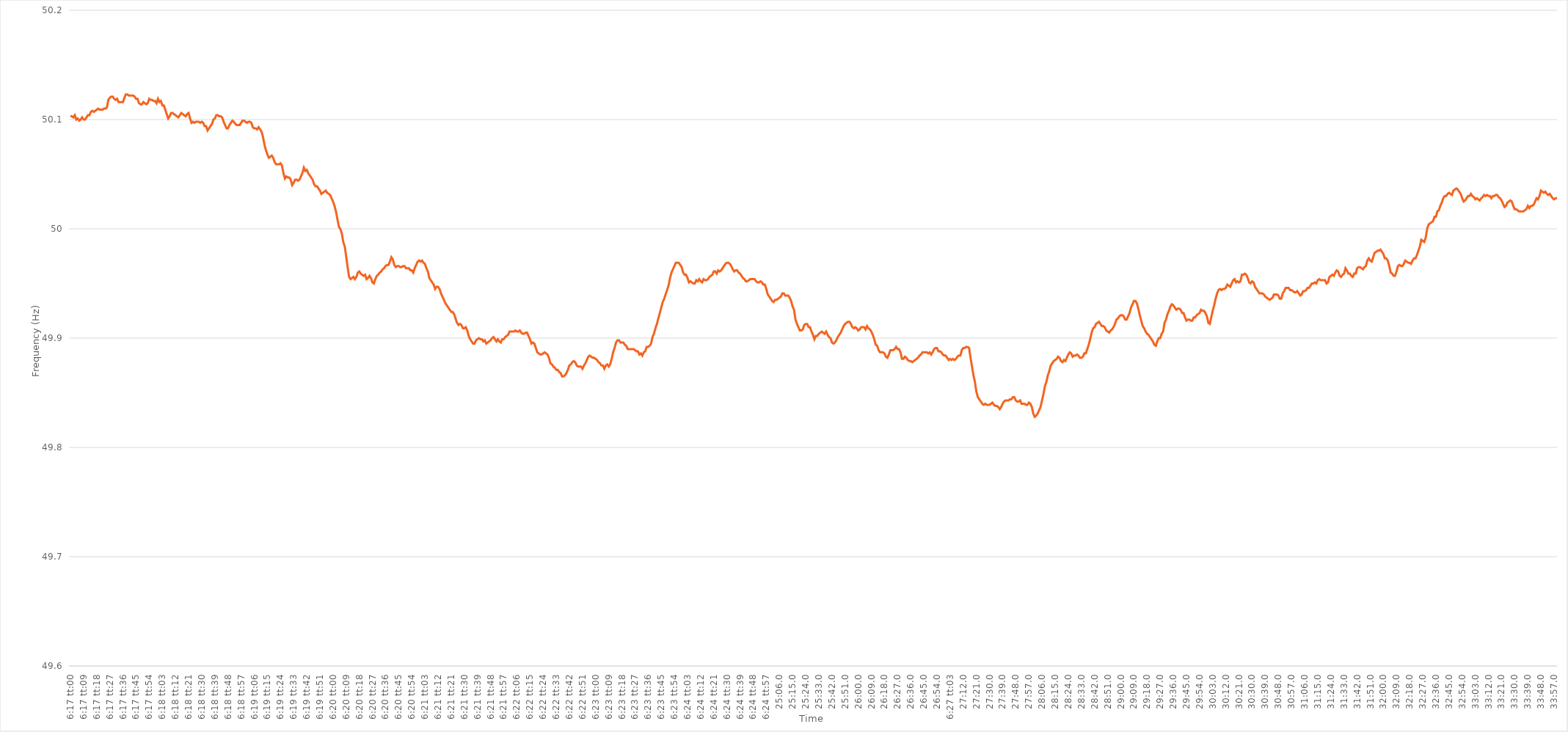
| Category | Series 0 |
|---|---|
| 0.26180555555555557 | 50.103 |
| 0.2618171296296296 | 50.103 |
| 0.2618287037037037 | 50.102 |
| 0.2618402777777778 | 50.104 |
| 0.26185185185185184 | 50.1 |
| 0.26186342592592593 | 50.101 |
| 0.261875 | 50.099 |
| 0.26188657407407406 | 50.1 |
| 0.26189814814814816 | 50.102 |
| 0.26190972222222225 | 50.1 |
| 0.2619212962962963 | 50.1 |
| 0.2619328703703704 | 50.102 |
| 0.2619444444444445 | 50.104 |
| 0.2619560185185185 | 50.104 |
| 0.26196759259259256 | 50.107 |
| 0.26197916666666665 | 50.108 |
| 0.26199074074074075 | 50.107 |
| 0.2620023148148148 | 50.108 |
| 0.2620138888888889 | 50.109 |
| 0.262025462962963 | 50.11 |
| 0.262037037037037 | 50.109 |
| 0.2620486111111111 | 50.109 |
| 0.2620601851851852 | 50.109 |
| 0.26207175925925924 | 50.11 |
| 0.26208333333333333 | 50.11 |
| 0.26209490740740743 | 50.111 |
| 0.26210648148148147 | 50.118 |
| 0.26211805555555556 | 50.12 |
| 0.26212962962962966 | 50.121 |
| 0.2621412037037037 | 50.121 |
| 0.2621527777777778 | 50.119 |
| 0.2621643518518519 | 50.118 |
| 0.2621759259259259 | 50.119 |
| 0.2621875 | 50.116 |
| 0.26219907407407406 | 50.116 |
| 0.26221064814814815 | 50.116 |
| 0.2622222222222222 | 50.116 |
| 0.2622337962962963 | 50.12 |
| 0.2622453703703704 | 50.123 |
| 0.2622569444444444 | 50.123 |
| 0.2622685185185185 | 50.122 |
| 0.2622800925925926 | 50.122 |
| 0.26229166666666665 | 50.122 |
| 0.26230324074074074 | 50.122 |
| 0.26231481481481483 | 50.121 |
| 0.2623263888888889 | 50.119 |
| 0.26233796296296297 | 50.119 |
| 0.26234953703703706 | 50.115 |
| 0.2623611111111111 | 50.114 |
| 0.2623726851851852 | 50.114 |
| 0.2623842592592593 | 50.116 |
| 0.26239583333333333 | 50.115 |
| 0.2624074074074074 | 50.114 |
| 0.2624189814814815 | 50.115 |
| 0.26243055555555556 | 50.119 |
| 0.2624421296296296 | 50.118 |
| 0.2624537037037037 | 50.118 |
| 0.2624652777777778 | 50.117 |
| 0.2624768518518518 | 50.117 |
| 0.2624884259259259 | 50.115 |
| 0.2625 | 50.119 |
| 0.26251157407407405 | 50.116 |
| 0.26252314814814814 | 50.117 |
| 0.26253472222222224 | 50.113 |
| 0.2625462962962963 | 50.113 |
| 0.26255787037037037 | 50.109 |
| 0.26256944444444447 | 50.105 |
| 0.2625810185185185 | 50.101 |
| 0.2625925925925926 | 50.103 |
| 0.2626041666666667 | 50.106 |
| 0.26261574074074073 | 50.106 |
| 0.2626273148148148 | 50.105 |
| 0.2626388888888889 | 50.104 |
| 0.26265046296296296 | 50.103 |
| 0.26266203703703705 | 50.102 |
| 0.2626736111111111 | 50.104 |
| 0.2626851851851852 | 50.106 |
| 0.2626967592592592 | 50.105 |
| 0.2627083333333333 | 50.104 |
| 0.2627199074074074 | 50.103 |
| 0.26273148148148145 | 50.105 |
| 0.26274305555555555 | 50.106 |
| 0.26275462962962964 | 50.101 |
| 0.2627662037037037 | 50.097 |
| 0.2627777777777778 | 50.098 |
| 0.26278935185185187 | 50.097 |
| 0.2628009259259259 | 50.098 |
| 0.2628125 | 50.098 |
| 0.2628240740740741 | 50.098 |
| 0.26283564814814814 | 50.097 |
| 0.26284722222222223 | 50.098 |
| 0.2628587962962963 | 50.097 |
| 0.26287037037037037 | 50.094 |
| 0.26288194444444446 | 50.094 |
| 0.26289351851851855 | 50.09 |
| 0.2629050925925926 | 50.092 |
| 0.26291666666666663 | 50.094 |
| 0.2629282407407407 | 50.096 |
| 0.2629398148148148 | 50.1 |
| 0.26295138888888886 | 50.101 |
| 0.26296296296296295 | 50.104 |
| 0.26297453703703705 | 50.104 |
| 0.2629861111111111 | 50.103 |
| 0.2629976851851852 | 50.103 |
| 0.2630092592592593 | 50.102 |
| 0.2630208333333333 | 50.098 |
| 0.2630324074074074 | 50.095 |
| 0.2630439814814815 | 50.092 |
| 0.26305555555555554 | 50.092 |
| 0.26306712962962964 | 50.095 |
| 0.26307870370370373 | 50.097 |
| 0.26309027777777777 | 50.099 |
| 0.26310185185185186 | 50.098 |
| 0.26311342592592596 | 50.096 |
| 0.263125 | 50.095 |
| 0.2631365740740741 | 50.095 |
| 0.26314814814814813 | 50.095 |
| 0.2631597222222222 | 50.097 |
| 0.26317129629629626 | 50.099 |
| 0.26318287037037036 | 50.099 |
| 0.26319444444444445 | 50.098 |
| 0.2632060185185185 | 50.097 |
| 0.2632175925925926 | 50.098 |
| 0.2632291666666667 | 50.098 |
| 0.2632407407407407 | 50.097 |
| 0.2632523148148148 | 50.093 |
| 0.2632638888888889 | 50.092 |
| 0.26327546296296295 | 50.092 |
| 0.26328703703703704 | 50.091 |
| 0.26329861111111114 | 50.093 |
| 0.2633101851851852 | 50.091 |
| 0.26332175925925927 | 50.089 |
| 0.26333333333333336 | 50.084 |
| 0.2633449074074074 | 50.077 |
| 0.2633564814814815 | 50.072 |
| 0.2633680555555556 | 50.068 |
| 0.26337962962962963 | 50.065 |
| 0.26339120370370367 | 50.066 |
| 0.26340277777777776 | 50.067 |
| 0.26341435185185186 | 50.065 |
| 0.2634259259259259 | 50.061 |
| 0.2634375 | 50.059 |
| 0.2634490740740741 | 50.059 |
| 0.2634606481481481 | 50.059 |
| 0.2634722222222222 | 50.06 |
| 0.2634837962962963 | 50.058 |
| 0.26349537037037035 | 50.051 |
| 0.26350694444444445 | 50.046 |
| 0.26351851851851854 | 50.048 |
| 0.2635300925925926 | 50.047 |
| 0.2635416666666667 | 50.047 |
| 0.26355324074074077 | 50.045 |
| 0.2635648148148148 | 50.04 |
| 0.2635763888888889 | 50.042 |
| 0.263587962962963 | 50.045 |
| 0.26359953703703703 | 50.045 |
| 0.26361111111111113 | 50.044 |
| 0.26362268518518517 | 50.045 |
| 0.26363425925925926 | 50.048 |
| 0.2636458333333333 | 50.051 |
| 0.2636574074074074 | 50.056 |
| 0.2636689814814815 | 50.053 |
| 0.26368055555555553 | 50.054 |
| 0.2636921296296296 | 50.051 |
| 0.2637037037037037 | 50.049 |
| 0.26371527777777776 | 50.047 |
| 0.26372685185185185 | 50.045 |
| 0.26373842592592595 | 50.041 |
| 0.26375 | 50.039 |
| 0.2637615740740741 | 50.039 |
| 0.2637731481481482 | 50.037 |
| 0.2637847222222222 | 50.035 |
| 0.2637962962962963 | 50.032 |
| 0.2638078703703704 | 50.033 |
| 0.26381944444444444 | 50.034 |
| 0.26383101851851853 | 50.035 |
| 0.26384259259259263 | 50.033 |
| 0.26385416666666667 | 50.032 |
| 0.2638657407407407 | 50.031 |
| 0.2638773148148148 | 50.028 |
| 0.2638888888888889 | 50.025 |
| 0.26390046296296293 | 50.021 |
| 0.26391203703703703 | 50.016 |
| 0.2639236111111111 | 50.009 |
| 0.26393518518518516 | 50.002 |
| 0.26394675925925926 | 50 |
| 0.26395833333333335 | 49.996 |
| 0.2639699074074074 | 49.988 |
| 0.2639814814814815 | 49.984 |
| 0.2639930555555556 | 49.975 |
| 0.2640046296296296 | 49.965 |
| 0.2640162037037037 | 49.956 |
| 0.2640277777777778 | 49.954 |
| 0.26403935185185184 | 49.955 |
| 0.26405092592592594 | 49.956 |
| 0.26406250000000003 | 49.954 |
| 0.26407407407407407 | 49.956 |
| 0.26408564814814817 | 49.96 |
| 0.2640972222222222 | 49.961 |
| 0.2641087962962963 | 49.959 |
| 0.26412037037037034 | 49.958 |
| 0.26413194444444443 | 49.957 |
| 0.2641435185185185 | 49.958 |
| 0.26415509259259257 | 49.954 |
| 0.26416666666666666 | 49.955 |
| 0.26417824074074076 | 49.957 |
| 0.2641898148148148 | 49.955 |
| 0.2642013888888889 | 49.951 |
| 0.264212962962963 | 49.95 |
| 0.264224537037037 | 49.954 |
| 0.2642361111111111 | 49.957 |
| 0.2642476851851852 | 49.958 |
| 0.26425925925925925 | 49.96 |
| 0.26427083333333334 | 49.961 |
| 0.26428240740740744 | 49.963 |
| 0.2642939814814815 | 49.964 |
| 0.26430555555555557 | 49.966 |
| 0.26431712962962967 | 49.967 |
| 0.2643287037037037 | 49.967 |
| 0.26434027777777774 | 49.97 |
| 0.26435185185185184 | 49.974 |
| 0.26436342592592593 | 49.972 |
| 0.26437499999999997 | 49.967 |
| 0.26438657407407407 | 49.965 |
| 0.26439814814814816 | 49.966 |
| 0.2644097222222222 | 49.966 |
| 0.2644212962962963 | 49.965 |
| 0.2644328703703704 | 49.965 |
| 0.2644444444444444 | 49.966 |
| 0.2644560185185185 | 49.966 |
| 0.2644675925925926 | 49.964 |
| 0.26447916666666665 | 49.964 |
| 0.26449074074074075 | 49.964 |
| 0.26450231481481484 | 49.962 |
| 0.2645138888888889 | 49.962 |
| 0.264525462962963 | 49.96 |
| 0.26453703703703707 | 49.964 |
| 0.2645486111111111 | 49.967 |
| 0.26456018518518515 | 49.97 |
| 0.26457175925925924 | 49.971 |
| 0.26458333333333334 | 49.97 |
| 0.2645949074074074 | 49.971 |
| 0.26460648148148147 | 49.969 |
| 0.26461805555555556 | 49.968 |
| 0.2646296296296296 | 49.964 |
| 0.2646412037037037 | 49.961 |
| 0.2646527777777778 | 49.955 |
| 0.26466435185185183 | 49.953 |
| 0.2646759259259259 | 49.951 |
| 0.2646875 | 49.949 |
| 0.26469907407407406 | 49.945 |
| 0.26471064814814815 | 49.947 |
| 0.26472222222222225 | 49.947 |
| 0.2647337962962963 | 49.945 |
| 0.2647453703703704 | 49.941 |
| 0.2647569444444445 | 49.938 |
| 0.2647685185185185 | 49.935 |
| 0.2647800925925926 | 49.932 |
| 0.2647916666666667 | 49.93 |
| 0.26480324074074074 | 49.928 |
| 0.2648148148148148 | 49.926 |
| 0.2648263888888889 | 49.924 |
| 0.26483796296296297 | 49.924 |
| 0.264849537037037 | 49.922 |
| 0.2648611111111111 | 49.918 |
| 0.2648726851851852 | 49.914 |
| 0.26488425925925924 | 49.912 |
| 0.26489583333333333 | 49.913 |
| 0.2649074074074074 | 49.912 |
| 0.26491898148148146 | 49.909 |
| 0.26493055555555556 | 49.909 |
| 0.26494212962962965 | 49.91 |
| 0.2649537037037037 | 49.907 |
| 0.2649652777777778 | 49.902 |
| 0.2649768518518519 | 49.899 |
| 0.2649884259259259 | 49.897 |
| 0.265 | 49.895 |
| 0.2650115740740741 | 49.895 |
| 0.26502314814814815 | 49.898 |
| 0.2650347222222222 | 49.899 |
| 0.2650462962962963 | 49.9 |
| 0.2650578703703704 | 49.899 |
| 0.2650694444444444 | 49.899 |
| 0.2650810185185185 | 49.897 |
| 0.2650925925925926 | 49.898 |
| 0.26510416666666664 | 49.895 |
| 0.26511574074074074 | 49.896 |
| 0.26512731481481483 | 49.897 |
| 0.26513888888888887 | 49.898 |
| 0.26515046296296296 | 49.9 |
| 0.26516203703703706 | 49.901 |
| 0.2651736111111111 | 49.899 |
| 0.2651851851851852 | 49.897 |
| 0.2651967592592593 | 49.899 |
| 0.2652083333333333 | 49.897 |
| 0.2652199074074074 | 49.896 |
| 0.2652314814814815 | 49.899 |
| 0.26524305555555555 | 49.899 |
| 0.26525462962962965 | 49.901 |
| 0.26526620370370374 | 49.902 |
| 0.2652777777777778 | 49.903 |
| 0.2652893518518518 | 49.906 |
| 0.2653009259259259 | 49.906 |
| 0.2653125 | 49.906 |
| 0.26532407407407405 | 49.906 |
| 0.26533564814814814 | 49.907 |
| 0.26534722222222223 | 49.906 |
| 0.2653587962962963 | 49.906 |
| 0.26537037037037037 | 49.907 |
| 0.26538194444444446 | 49.905 |
| 0.2653935185185185 | 49.904 |
| 0.2654050925925926 | 49.904 |
| 0.2654166666666667 | 49.905 |
| 0.26542824074074073 | 49.905 |
| 0.2654398148148148 | 49.902 |
| 0.2654513888888889 | 49.899 |
| 0.26546296296296296 | 49.895 |
| 0.26547453703703705 | 49.896 |
| 0.26548611111111114 | 49.895 |
| 0.2654976851851852 | 49.891 |
| 0.2655092592592592 | 49.887 |
| 0.2655208333333333 | 49.886 |
| 0.2655324074074074 | 49.885 |
| 0.26554398148148145 | 49.885 |
| 0.26555555555555554 | 49.886 |
| 0.26556712962962964 | 49.887 |
| 0.2655787037037037 | 49.886 |
| 0.2655902777777778 | 49.885 |
| 0.26560185185185187 | 49.882 |
| 0.2656134259259259 | 49.877 |
| 0.265625 | 49.876 |
| 0.2656365740740741 | 49.874 |
| 0.26564814814814813 | 49.873 |
| 0.2656597222222222 | 49.871 |
| 0.2656712962962963 | 49.871 |
| 0.26568287037037036 | 49.869 |
| 0.26569444444444446 | 49.868 |
| 0.26570601851851855 | 49.865 |
| 0.2657175925925926 | 49.865 |
| 0.2657291666666667 | 49.866 |
| 0.2657407407407408 | 49.868 |
| 0.2657523148148148 | 49.871 |
| 0.26576388888888886 | 49.875 |
| 0.26577546296296295 | 49.876 |
| 0.26578703703703704 | 49.878 |
| 0.2657986111111111 | 49.879 |
| 0.2658101851851852 | 49.878 |
| 0.26582175925925927 | 49.875 |
| 0.2658333333333333 | 49.874 |
| 0.2658449074074074 | 49.874 |
| 0.2658564814814815 | 49.874 |
| 0.26586805555555554 | 49.872 |
| 0.26587962962962963 | 49.875 |
| 0.2658912037037037 | 49.877 |
| 0.26590277777777777 | 49.88 |
| 0.26591435185185186 | 49.883 |
| 0.26592592592592595 | 49.884 |
| 0.2659375 | 49.883 |
| 0.2659490740740741 | 49.882 |
| 0.2659606481481482 | 49.882 |
| 0.2659722222222222 | 49.881 |
| 0.26598379629629626 | 49.88 |
| 0.26599537037037035 | 49.878 |
| 0.26600694444444445 | 49.877 |
| 0.2660185185185185 | 49.875 |
| 0.2660300925925926 | 49.875 |
| 0.2660416666666667 | 49.872 |
| 0.2660532407407407 | 49.875 |
| 0.2660648148148148 | 49.876 |
| 0.2660763888888889 | 49.874 |
| 0.26608796296296294 | 49.876 |
| 0.26609953703703704 | 49.881 |
| 0.26611111111111113 | 49.887 |
| 0.26612268518518517 | 49.891 |
| 0.26613425925925926 | 49.896 |
| 0.26614583333333336 | 49.898 |
| 0.2661574074074074 | 49.898 |
| 0.2661689814814815 | 49.896 |
| 0.2661805555555556 | 49.896 |
| 0.2661921296296296 | 49.896 |
| 0.2662037037037037 | 49.894 |
| 0.2662152777777778 | 49.893 |
| 0.26622685185185185 | 49.89 |
| 0.2662384259259259 | 49.89 |
| 0.26625 | 49.89 |
| 0.2662615740740741 | 49.89 |
| 0.2662731481481481 | 49.89 |
| 0.2662847222222222 | 49.889 |
| 0.2662962962962963 | 49.888 |
| 0.26630787037037035 | 49.888 |
| 0.26631944444444444 | 49.885 |
| 0.26633101851851854 | 49.886 |
| 0.2663425925925926 | 49.884 |
| 0.26635416666666667 | 49.887 |
| 0.26636574074074076 | 49.888 |
| 0.2663773148148148 | 49.892 |
| 0.2663888888888889 | 49.892 |
| 0.266400462962963 | 49.893 |
| 0.26641203703703703 | 49.895 |
| 0.2664236111111111 | 49.901 |
| 0.2664351851851852 | 49.904 |
| 0.26644675925925926 | 49.909 |
| 0.2664583333333333 | 49.913 |
| 0.2664699074074074 | 49.918 |
| 0.2664814814814815 | 49.923 |
| 0.2664930555555555 | 49.928 |
| 0.2665046296296296 | 49.933 |
| 0.2665162037037037 | 49.936 |
| 0.26652777777777775 | 49.94 |
| 0.26653935185185185 | 49.944 |
| 0.26655092592592594 | 49.948 |
| 0.2665625 | 49.955 |
| 0.2665740740740741 | 49.96 |
| 0.26658564814814817 | 49.963 |
| 0.2665972222222222 | 49.966 |
| 0.2666087962962963 | 49.969 |
| 0.2666203703703704 | 49.969 |
| 0.26663194444444444 | 49.969 |
| 0.26664351851851853 | 49.967 |
| 0.2666550925925926 | 49.965 |
| 0.26666666666666666 | 49.96 |
| 0.26667824074074076 | 49.958 |
| 0.26668981481481485 | 49.958 |
| 0.2667013888888889 | 49.955 |
| 0.26671296296296293 | 49.951 |
| 0.266724537037037 | 49.952 |
| 0.2667361111111111 | 49.951 |
| 0.26674768518518516 | 49.95 |
| 0.26675925925925925 | 49.95 |
| 0.26677083333333335 | 49.953 |
| 0.2667824074074074 | 49.952 |
| 0.2667939814814815 | 49.954 |
| 0.2668055555555556 | 49.952 |
| 0.2668171296296296 | 49.951 |
| 0.2668287037037037 | 49.954 |
| 0.2668402777777778 | 49.953 |
| 0.26685185185185184 | 49.953 |
| 0.26686342592592593 | 49.954 |
| 0.26687500000000003 | 49.956 |
| 0.26688657407407407 | 49.957 |
| 0.26689814814814816 | 49.958 |
| 0.26690972222222226 | 49.961 |
| 0.2669212962962963 | 49.961 |
| 0.26693287037037033 | 49.959 |
| 0.26694444444444443 | 49.962 |
| 0.2669560185185185 | 49.961 |
| 0.26696759259259256 | 49.962 |
| 0.26697916666666666 | 49.964 |
| 0.26699074074074075 | 49.966 |
| 0.2670023148148148 | 49.968 |
| 0.2670138888888889 | 49.969 |
| 0.267025462962963 | 49.969 |
| 0.267037037037037 | 49.968 |
| 0.2670486111111111 | 49.966 |
| 0.2670601851851852 | 49.963 |
| 0.26707175925925924 | 49.961 |
| 0.26708333333333334 | 49.962 |
| 0.26709490740740743 | 49.962 |
| 0.2671064814814815 | 49.96 |
| 0.26711805555555557 | 49.959 |
| 0.26712962962962966 | 49.957 |
| 0.2671412037037037 | 49.955 |
| 0.2671527777777778 | 49.954 |
| 0.26716435185185183 | 49.952 |
| 0.26717592592592593 | 49.952 |
| 0.26718749999999997 | 49.953 |
| 0.26719907407407406 | 49.954 |
| 0.26721064814814816 | 49.954 |
| 0.2672222222222222 | 49.954 |
| 0.2672337962962963 | 49.954 |
| 0.2672453703703704 | 49.952 |
| 0.2672569444444444 | 49.951 |
| 0.2672685185185185 | 49.951 |
| 0.2672800925925926 | 49.952 |
| 0.26729166666666665 | 49.951 |
| 0.26730324074074074 | 49.949 |
| 0.26731481481481484 | 49.949 |
| 0.2673263888888889 | 49.945 |
| 0.26733796296296297 | 49.94 |
| 0.26734953703703707 | 49.938 |
| 0.2673611111111111 | 49.936 |
| 0.2673726851851852 | 49.934 |
| 0.2673842592592593 | 49.933 |
| 0.26739583333333333 | 49.935 |
| 0.26740740740740737 | 49.935 |
| 0.26741898148148147 | 49.936 |
| 0.26743055555555556 | 49.937 |
| 0.2674421296296296 | 49.938 |
| 0.2674537037037037 | 49.941 |
| 0.2674652777777778 | 49.941 |
| 0.2674768518518518 | 49.939 |
| 0.2674884259259259 | 49.939 |
| 0.2675 | 49.939 |
| 0.26751157407407405 | 49.937 |
| 0.26752314814814815 | 49.934 |
| 0.26753472222222224 | 49.929 |
| 0.2675462962962963 | 49.926 |
| 0.2675578703703704 | 49.917 |
| 0.26756944444444447 | 49.913 |
| 0.2675810185185185 | 49.91 |
| 0.2675925925925926 | 49.907 |
| 0.2676041666666667 | 49.907 |
| 0.26761574074074074 | 49.908 |
| 0.26762731481481483 | 49.912 |
| 0.26763888888888887 | 49.913 |
| 0.26765046296296297 | 49.913 |
| 0.267662037037037 | 49.91 |
| 0.2676736111111111 | 49.91 |
| 0.2676851851851852 | 49.906 |
| 0.26769675925925923 | 49.903 |
| 0.2677083333333333 | 49.899 |
| 0.2677199074074074 | 49.902 |
| 0.26773148148148146 | 49.902 |
| 0.26774305555555555 | 49.904 |
| 0.26775462962962965 | 49.905 |
| 0.2677662037037037 | 49.906 |
| 0.2677777777777778 | 49.905 |
| 0.2677893518518519 | 49.904 |
| 0.2678009259259259 | 49.906 |
| 0.2678125 | 49.903 |
| 0.2678240740740741 | 49.901 |
| 0.26783564814814814 | 49.9 |
| 0.26784722222222224 | 49.896 |
| 0.26785879629629633 | 49.895 |
| 0.26787037037037037 | 49.896 |
| 0.2678819444444444 | 49.898 |
| 0.2678935185185185 | 49.901 |
| 0.2679050925925926 | 49.903 |
| 0.26791666666666664 | 49.905 |
| 0.26792824074074073 | 49.908 |
| 0.2679398148148148 | 49.911 |
| 0.26795138888888886 | 49.913 |
| 0.26796296296296296 | 49.914 |
| 0.26797453703703705 | 49.915 |
| 0.2679861111111111 | 49.915 |
| 0.2679976851851852 | 49.913 |
| 0.2680092592592593 | 49.91 |
| 0.2680208333333333 | 49.909 |
| 0.2680324074074074 | 49.91 |
| 0.2680439814814815 | 49.909 |
| 0.26805555555555555 | 49.907 |
| 0.26806712962962964 | 49.908 |
| 0.26807870370370374 | 49.91 |
| 0.2680902777777778 | 49.91 |
| 0.26810185185185187 | 49.91 |
| 0.2681134259259259 | 49.908 |
| 0.268125 | 49.911 |
| 0.26813657407407404 | 49.909 |
| 0.26814814814814814 | 49.908 |
| 0.26815972222222223 | 49.906 |
| 0.26817129629629627 | 49.903 |
| 0.26818287037037036 | 49.899 |
| 0.26819444444444446 | 49.894 |
| 0.2682060185185185 | 49.893 |
| 0.2682175925925926 | 49.889 |
| 0.2682291666666667 | 49.887 |
| 0.2682407407407407 | 49.887 |
| 0.2682523148148148 | 49.887 |
| 0.2682638888888889 | 49.886 |
| 0.26827546296296295 | 49.883 |
| 0.26828703703703705 | 49.882 |
| 0.26829861111111114 | 49.885 |
| 0.2683101851851852 | 49.889 |
| 0.2683217592592593 | 49.889 |
| 0.26833333333333337 | 49.889 |
| 0.2683449074074074 | 49.89 |
| 0.26835648148148145 | 49.892 |
| 0.26836805555555554 | 49.89 |
| 0.26837962962962963 | 49.89 |
| 0.2683912037037037 | 49.887 |
| 0.26840277777777777 | 49.881 |
| 0.26841435185185186 | 49.881 |
| 0.2684259259259259 | 49.883 |
| 0.2684375 | 49.882 |
| 0.2684490740740741 | 49.88 |
| 0.26846064814814813 | 49.879 |
| 0.2684722222222222 | 49.879 |
| 0.2684837962962963 | 49.878 |
| 0.26849537037037036 | 49.879 |
| 0.26850694444444445 | 49.88 |
| 0.26851851851851855 | 49.881 |
| 0.2685300925925926 | 49.882 |
| 0.2685416666666667 | 49.884 |
| 0.2685532407407408 | 49.885 |
| 0.2685648148148148 | 49.887 |
| 0.2685763888888889 | 49.887 |
| 0.26858796296296295 | 49.887 |
| 0.26859953703703704 | 49.887 |
| 0.2686111111111111 | 49.886 |
| 0.2686226851851852 | 49.887 |
| 0.26863425925925927 | 49.885 |
| 0.2686458333333333 | 49.887 |
| 0.2686574074074074 | 49.89 |
| 0.2686689814814815 | 49.891 |
| 0.26868055555555553 | 49.891 |
| 0.26869212962962963 | 49.888 |
| 0.2687037037037037 | 49.888 |
| 0.26871527777777776 | 49.887 |
| 0.26872685185185186 | 49.885 |
| 0.26873842592592595 | 49.884 |
| 0.26875 | 49.884 |
| 0.2687615740740741 | 49.882 |
| 0.2687731481481482 | 49.88 |
| 0.2687847222222222 | 49.881 |
| 0.2687962962962963 | 49.88 |
| 0.2688078703703704 | 49.881 |
| 0.26881944444444444 | 49.88 |
| 0.2688310185185185 | 49.881 |
| 0.2688425925925926 | 49.883 |
| 0.26885416666666667 | 49.884 |
| 0.2688657407407407 | 49.884 |
| 0.2688773148148148 | 49.889 |
| 0.2688888888888889 | 49.891 |
| 0.26890046296296294 | 49.891 |
| 0.26891203703703703 | 49.892 |
| 0.2689236111111111 | 49.892 |
| 0.26893518518518517 | 49.891 |
| 0.26894675925925926 | 49.882 |
| 0.26895833333333335 | 49.874 |
| 0.2689699074074074 | 49.866 |
| 0.2689814814814815 | 49.86 |
| 0.2689930555555556 | 49.851 |
| 0.2690046296296296 | 49.846 |
| 0.2690162037037037 | 49.844 |
| 0.2690277777777778 | 49.842 |
| 0.26903935185185185 | 49.84 |
| 0.26905092592592594 | 49.839 |
| 0.2690625 | 49.84 |
| 0.2690740740740741 | 49.839 |
| 0.2690856481481481 | 49.839 |
| 0.2690972222222222 | 49.839 |
| 0.2691087962962963 | 49.84 |
| 0.26912037037037034 | 49.841 |
| 0.26913194444444444 | 49.839 |
| 0.26914351851851853 | 49.838 |
| 0.26915509259259257 | 49.838 |
| 0.26916666666666667 | 49.837 |
| 0.26917824074074076 | 49.835 |
| 0.2691898148148148 | 49.837 |
| 0.2692013888888889 | 49.84 |
| 0.269212962962963 | 49.842 |
| 0.269224537037037 | 49.843 |
| 0.2692361111111111 | 49.843 |
| 0.2692476851851852 | 49.843 |
| 0.26925925925925925 | 49.844 |
| 0.26927083333333335 | 49.844 |
| 0.26928240740740744 | 49.846 |
| 0.2692939814814815 | 49.846 |
| 0.2693055555555555 | 49.843 |
| 0.2693171296296296 | 49.842 |
| 0.2693287037037037 | 49.842 |
| 0.26934027777777775 | 49.843 |
| 0.26935185185185184 | 49.84 |
| 0.26936342592592594 | 49.84 |
| 0.269375 | 49.84 |
| 0.26938657407407407 | 49.839 |
| 0.26939814814814816 | 49.839 |
| 0.2694097222222222 | 49.841 |
| 0.2694212962962963 | 49.84 |
| 0.2694328703703704 | 49.837 |
| 0.26944444444444443 | 49.831 |
| 0.2694560185185185 | 49.828 |
| 0.2694675925925926 | 49.829 |
| 0.26947916666666666 | 49.831 |
| 0.26949074074074075 | 49.834 |
| 0.26950231481481485 | 49.837 |
| 0.2695138888888889 | 49.843 |
| 0.269525462962963 | 49.849 |
| 0.269537037037037 | 49.856 |
| 0.2695486111111111 | 49.86 |
| 0.26956018518518515 | 49.866 |
| 0.26957175925925925 | 49.87 |
| 0.26958333333333334 | 49.875 |
| 0.2695949074074074 | 49.877 |
| 0.2696064814814815 | 49.879 |
| 0.26961805555555557 | 49.88 |
| 0.2696296296296296 | 49.881 |
| 0.2696412037037037 | 49.883 |
| 0.2696527777777778 | 49.882 |
| 0.26966435185185184 | 49.879 |
| 0.26967592592592593 | 49.878 |
| 0.2696875 | 49.88 |
| 0.26969907407407406 | 49.879 |
| 0.26971064814814816 | 49.882 |
| 0.26972222222222225 | 49.885 |
| 0.2697337962962963 | 49.887 |
| 0.2697453703703704 | 49.886 |
| 0.2697569444444445 | 49.883 |
| 0.2697685185185185 | 49.884 |
| 0.26978009259259256 | 49.884 |
| 0.26979166666666665 | 49.885 |
| 0.26980324074074075 | 49.884 |
| 0.2698148148148148 | 49.882 |
| 0.2698263888888889 | 49.882 |
| 0.269837962962963 | 49.883 |
| 0.269849537037037 | 49.886 |
| 0.2698611111111111 | 49.886 |
| 0.2698726851851852 | 49.89 |
| 0.26988425925925924 | 49.894 |
| 0.26989583333333333 | 49.899 |
| 0.26990740740740743 | 49.905 |
| 0.26991898148148147 | 49.909 |
| 0.26993055555555556 | 49.91 |
| 0.26994212962962966 | 49.913 |
| 0.2699537037037037 | 49.914 |
| 0.2699652777777778 | 49.915 |
| 0.2699768518518519 | 49.913 |
| 0.2699884259259259 | 49.911 |
| 0.27 | 49.911 |
| 0.27001157407407406 | 49.91 |
| 0.27002314814814815 | 49.907 |
| 0.2700347222222222 | 49.906 |
| 0.2700462962962963 | 49.905 |
| 0.2700578703703704 | 49.907 |
| 0.2700694444444444 | 49.908 |
| 0.2700810185185185 | 49.91 |
| 0.2700925925925926 | 49.913 |
| 0.27010416666666665 | 49.917 |
| 0.27011574074074074 | 49.918 |
| 0.27012731481481483 | 49.92 |
| 0.2701388888888889 | 49.921 |
| 0.27015046296296297 | 49.921 |
| 0.27016203703703706 | 49.92 |
| 0.2701736111111111 | 49.917 |
| 0.2701851851851852 | 49.917 |
| 0.2701967592592593 | 49.92 |
| 0.27020833333333333 | 49.923 |
| 0.2702199074074074 | 49.928 |
| 0.2702314814814815 | 49.931 |
| 0.27024305555555556 | 49.934 |
| 0.2702546296296296 | 49.934 |
| 0.2702662037037037 | 49.932 |
| 0.2702777777777778 | 49.927 |
| 0.2702893518518518 | 49.921 |
| 0.2703009259259259 | 49.916 |
| 0.2703125 | 49.911 |
| 0.27032407407407405 | 49.909 |
| 0.27033564814814814 | 49.906 |
| 0.27034722222222224 | 49.904 |
| 0.2703587962962963 | 49.903 |
| 0.27037037037037037 | 49.901 |
| 0.27038194444444447 | 49.899 |
| 0.2703935185185185 | 49.897 |
| 0.2704050925925926 | 49.894 |
| 0.2704166666666667 | 49.893 |
| 0.27042824074074073 | 49.897 |
| 0.2704398148148148 | 49.9 |
| 0.2704513888888889 | 49.9 |
| 0.27046296296296296 | 49.904 |
| 0.27047453703703705 | 49.906 |
| 0.2704861111111111 | 49.914 |
| 0.2704976851851852 | 49.917 |
| 0.2705092592592592 | 49.922 |
| 0.2705208333333333 | 49.925 |
| 0.2705324074074074 | 49.929 |
| 0.27054398148148145 | 49.931 |
| 0.27055555555555555 | 49.93 |
| 0.27056712962962964 | 49.928 |
| 0.2705787037037037 | 49.926 |
| 0.2705902777777778 | 49.927 |
| 0.27060185185185187 | 49.927 |
| 0.2706134259259259 | 49.926 |
| 0.270625 | 49.923 |
| 0.2706365740740741 | 49.923 |
| 0.27064814814814814 | 49.919 |
| 0.27065972222222223 | 49.916 |
| 0.2706712962962963 | 49.917 |
| 0.27068287037037037 | 49.917 |
| 0.27069444444444446 | 49.916 |
| 0.27070601851851855 | 49.916 |
| 0.2707175925925926 | 49.919 |
| 0.27072916666666663 | 49.919 |
| 0.2707407407407407 | 49.921 |
| 0.2707523148148148 | 49.922 |
| 0.27076388888888886 | 49.923 |
| 0.27077546296296295 | 49.926 |
| 0.27078703703703705 | 49.925 |
| 0.2707986111111111 | 49.925 |
| 0.2708101851851852 | 49.923 |
| 0.2708217592592593 | 49.92 |
| 0.2708333333333333 | 49.914 |
| 0.2708449074074074 | 49.913 |
| 0.2708564814814815 | 49.919 |
| 0.27086805555555554 | 49.925 |
| 0.27087962962962964 | 49.93 |
| 0.27089120370370373 | 49.936 |
| 0.27090277777777777 | 49.941 |
| 0.27091435185185186 | 49.944 |
| 0.27092592592592596 | 49.945 |
| 0.2709375 | 49.944 |
| 0.2709490740740741 | 49.945 |
| 0.27096064814814813 | 49.945 |
| 0.2709722222222222 | 49.946 |
| 0.27098379629629626 | 49.949 |
| 0.27099537037037036 | 49.948 |
| 0.27100694444444445 | 49.947 |
| 0.2710185185185185 | 49.95 |
| 0.2710300925925926 | 49.953 |
| 0.2710416666666667 | 49.954 |
| 0.2710532407407407 | 49.951 |
| 0.2710648148148148 | 49.952 |
| 0.2710763888888889 | 49.951 |
| 0.27108796296296295 | 49.952 |
| 0.27109953703703704 | 49.958 |
| 0.27111111111111114 | 49.958 |
| 0.2711226851851852 | 49.959 |
| 0.27113425925925927 | 49.958 |
| 0.27114583333333336 | 49.955 |
| 0.2711574074074074 | 49.951 |
| 0.2711689814814815 | 49.95 |
| 0.27118055555555554 | 49.952 |
| 0.27119212962962963 | 49.951 |
| 0.27120370370370367 | 49.947 |
| 0.27121527777777776 | 49.945 |
| 0.27122685185185186 | 49.943 |
| 0.2712384259259259 | 49.941 |
| 0.27125 | 49.941 |
| 0.2712615740740741 | 49.941 |
| 0.2712731481481481 | 49.94 |
| 0.2712847222222222 | 49.938 |
| 0.2712962962962963 | 49.937 |
| 0.27130787037037035 | 49.936 |
| 0.27131944444444445 | 49.935 |
| 0.27133101851851854 | 49.936 |
| 0.2713425925925926 | 49.937 |
| 0.2713541666666667 | 49.94 |
| 0.27136574074074077 | 49.94 |
| 0.2713773148148148 | 49.94 |
| 0.2713888888888889 | 49.939 |
| 0.271400462962963 | 49.936 |
| 0.27141203703703703 | 49.936 |
| 0.2714236111111111 | 49.941 |
| 0.2714351851851852 | 49.943 |
| 0.27144675925925926 | 49.946 |
| 0.2714583333333333 | 49.946 |
| 0.2714699074074074 | 49.946 |
| 0.2714814814814815 | 49.944 |
| 0.27149305555555553 | 49.944 |
| 0.2715046296296296 | 49.943 |
| 0.2715162037037037 | 49.942 |
| 0.27152777777777776 | 49.942 |
| 0.27153935185185185 | 49.943 |
| 0.27155092592592595 | 49.941 |
| 0.2715625 | 49.939 |
| 0.2715740740740741 | 49.94 |
| 0.2715856481481482 | 49.943 |
| 0.2715972222222222 | 49.943 |
| 0.2716087962962963 | 49.944 |
| 0.2716203703703704 | 49.946 |
| 0.27163194444444444 | 49.946 |
| 0.27164351851851853 | 49.948 |
| 0.27165509259259263 | 49.95 |
| 0.27166666666666667 | 49.95 |
| 0.2716782407407407 | 49.951 |
| 0.2716898148148148 | 49.95 |
| 0.2717013888888889 | 49.953 |
| 0.27171296296296293 | 49.954 |
| 0.27172453703703703 | 49.953 |
| 0.2717361111111111 | 49.953 |
| 0.27174768518518516 | 49.953 |
| 0.27175925925925926 | 49.953 |
| 0.27177083333333335 | 49.95 |
| 0.2717824074074074 | 49.951 |
| 0.2717939814814815 | 49.956 |
| 0.2718055555555556 | 49.957 |
| 0.2718171296296296 | 49.958 |
| 0.2718287037037037 | 49.957 |
| 0.2718402777777778 | 49.96 |
| 0.27185185185185184 | 49.962 |
| 0.27186342592592594 | 49.961 |
| 0.27187500000000003 | 49.957 |
| 0.27188657407407407 | 49.956 |
| 0.27189814814814817 | 49.958 |
| 0.2719097222222222 | 49.959 |
| 0.2719212962962963 | 49.964 |
| 0.27193287037037034 | 49.962 |
| 0.27194444444444443 | 49.959 |
| 0.2719560185185185 | 49.959 |
| 0.27196759259259257 | 49.957 |
| 0.27197916666666666 | 49.956 |
| 0.27199074074074076 | 49.959 |
| 0.2720023148148148 | 49.959 |
| 0.2720138888888889 | 49.964 |
| 0.272025462962963 | 49.965 |
| 0.272037037037037 | 49.965 |
| 0.2720486111111111 | 49.964 |
| 0.2720601851851852 | 49.963 |
| 0.27207175925925925 | 49.965 |
| 0.27208333333333334 | 49.966 |
| 0.27209490740740744 | 49.971 |
| 0.2721064814814815 | 49.973 |
| 0.27211805555555557 | 49.971 |
| 0.2721296296296296 | 49.97 |
| 0.2721412037037037 | 49.974 |
| 0.27215277777777774 | 49.978 |
| 0.27216435185185184 | 49.979 |
| 0.27217592592592593 | 49.98 |
| 0.27218749999999997 | 49.98 |
| 0.27219907407407407 | 49.981 |
| 0.27221064814814816 | 49.979 |
| 0.2722222222222222 | 49.977 |
| 0.2722337962962963 | 49.973 |
| 0.2722453703703704 | 49.973 |
| 0.2722569444444444 | 49.971 |
| 0.2722685185185185 | 49.966 |
| 0.2722800925925926 | 49.96 |
| 0.27229166666666665 | 49.959 |
| 0.27230324074074075 | 49.957 |
| 0.27231481481481484 | 49.957 |
| 0.2723263888888889 | 49.961 |
| 0.272337962962963 | 49.966 |
| 0.272349537037037 | 49.967 |
| 0.2723611111111111 | 49.966 |
| 0.27237268518518515 | 49.966 |
| 0.2723842592592593 | 49.968 |
| 0.27239583333333334 | 49.971 |
| 0.2724074074074074 | 49.97 |
| 0.27241898148148147 | 49.969 |
| 0.27243055555555556 | 49.969 |
| 0.2724421296296296 | 49.968 |
| 0.2724537037037037 | 49.971 |
| 0.2724652777777778 | 49.973 |
| 0.27247685185185183 | 49.973 |
| 0.2724884259259259 | 49.976 |
| 0.2725 | 49.98 |
| 0.27251157407407406 | 49.984 |
| 0.27252314814814815 | 49.99 |
| 0.27253472222222225 | 49.989 |
| 0.2725462962962963 | 49.988 |
| 0.2725578703703704 | 49.992 |
| 0.2725694444444445 | 50 |
| 0.2725810185185185 | 50.004 |
| 0.27259259259259255 | 50.005 |
| 0.2726041666666667 | 50.006 |
| 0.27261574074074074 | 50.007 |
| 0.27262731481481484 | 50.011 |
| 0.2726388888888889 | 50.011 |
| 0.27265046296296297 | 50.016 |
| 0.272662037037037 | 50.017 |
| 0.2726736111111111 | 50.021 |
| 0.2726851851851852 | 50.024 |
| 0.27269675925925924 | 50.028 |
| 0.27270833333333333 | 50.03 |
| 0.2727199074074074 | 50.03 |
| 0.27273148148148146 | 50.032 |
| 0.27274305555555556 | 50.033 |
| 0.27275462962962965 | 50.032 |
| 0.2727662037037037 | 50.031 |
| 0.2727777777777778 | 50.035 |
| 0.2727893518518519 | 50.036 |
| 0.2728009259259259 | 50.037 |
| 0.2728125 | 50.036 |
| 0.2728240740740741 | 50.034 |
| 0.27283564814814815 | 50.032 |
| 0.27284722222222224 | 50.028 |
| 0.2728587962962963 | 50.025 |
| 0.2728703703703704 | 50.026 |
| 0.2728819444444444 | 50.028 |
| 0.2728935185185185 | 50.03 |
| 0.2729050925925926 | 50.03 |
| 0.27291666666666664 | 50.032 |
| 0.27292824074074074 | 50.03 |
| 0.27293981481481483 | 50.029 |
| 0.27295138888888887 | 50.027 |
| 0.27296296296296296 | 50.028 |
| 0.27297453703703706 | 50.027 |
| 0.2729861111111111 | 50.026 |
| 0.2729976851851852 | 50.028 |
| 0.2730092592592593 | 50.029 |
| 0.2730208333333333 | 50.031 |
| 0.2730324074074074 | 50.03 |
| 0.2730439814814815 | 50.031 |
| 0.27305555555555555 | 50.03 |
| 0.27306712962962965 | 50.03 |
| 0.2730787037037037 | 50.028 |
| 0.2730902777777778 | 50.03 |
| 0.2731018518518518 | 50.03 |
| 0.2731134259259259 | 50.031 |
| 0.273125 | 50.031 |
| 0.27313657407407405 | 50.029 |
| 0.27314814814814814 | 50.028 |
| 0.27315972222222223 | 50.026 |
| 0.2731712962962963 | 50.023 |
| 0.27318287037037037 | 50.02 |
| 0.27319444444444446 | 50.021 |
| 0.2732060185185185 | 50.024 |
| 0.2732175925925926 | 50.025 |
| 0.2732291666666667 | 50.026 |
| 0.27324074074074073 | 50.025 |
| 0.2732523148148148 | 50.021 |
| 0.2732638888888889 | 50.018 |
| 0.27327546296296296 | 50.018 |
| 0.27328703703703705 | 50.017 |
| 0.2732986111111111 | 50.016 |
| 0.2733101851851852 | 50.016 |
| 0.2733217592592592 | 50.016 |
| 0.2733333333333334 | 50.016 |
| 0.2733449074074074 | 50.017 |
| 0.27335648148148145 | 50.018 |
| 0.27336805555555554 | 50.021 |
| 0.27337962962962964 | 50.019 |
| 0.2733912037037037 | 50.021 |
| 0.2734027777777778 | 50.021 |
| 0.27341435185185187 | 50.022 |
| 0.2734259259259259 | 50.025 |
| 0.2734375 | 50.028 |
| 0.2734490740740741 | 50.027 |
| 0.27346064814814813 | 50.03 |
| 0.2734722222222222 | 50.035 |
| 0.2734837962962963 | 50.034 |
| 0.27349537037037036 | 50.033 |
| 0.27350694444444446 | 50.034 |
| 0.27351851851851855 | 50.032 |
| 0.2735300925925926 | 50.031 |
| 0.2735416666666666 | 50.032 |
| 0.2735532407407408 | 50.03 |
| 0.2735648148148148 | 50.028 |
| 0.2735763888888889 | 50.027 |
| 0.27358796296296295 | 50.028 |
| 0.27359953703703704 | 50.028 |